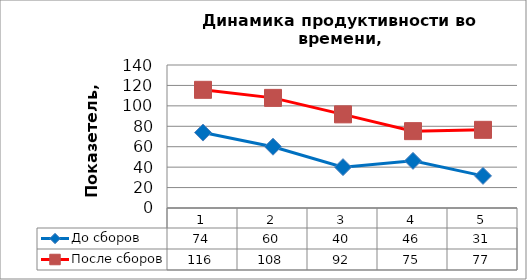
| Category | До сборов | После сборов |
|---|---|---|
| 0 | 73.846 | 115.694 |
| 1 | 60 | 107.812 |
| 2 | 40 | 91.677 |
| 3 | 46.154 | 75.238 |
| 4 | 31.429 | 76.522 |